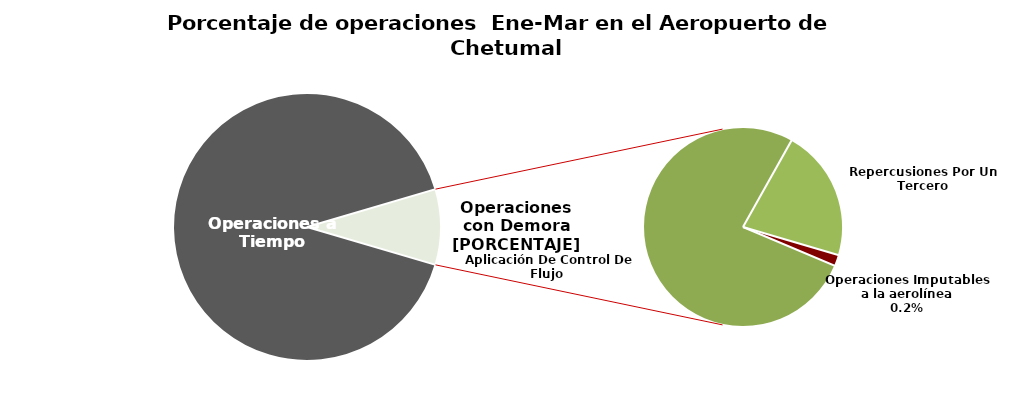
| Category | Series 0 |
|---|---|
| Operaciones a Tiempo | 558 |
| Operaciones Imputables a la aerolínea | 1 |
| Aplicación De Control De Flujo  | 43 |
| Repercusiones Por Un Tercero | 12 |